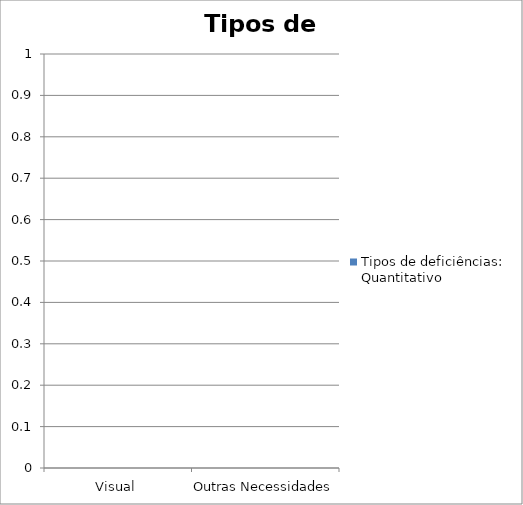
| Category | Tipos de deficiências: Quantitativo |
|---|---|
| Visual | 0 |
| Outras Necessidades  | 0 |